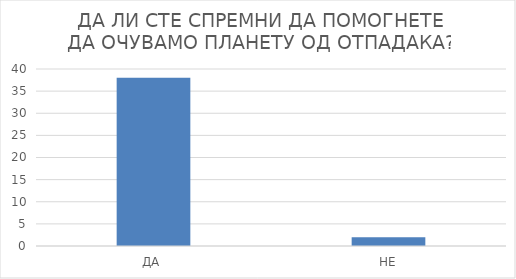
| Category | Series 0 |
|---|---|
| ДА | 38 |
| НЕ | 2 |